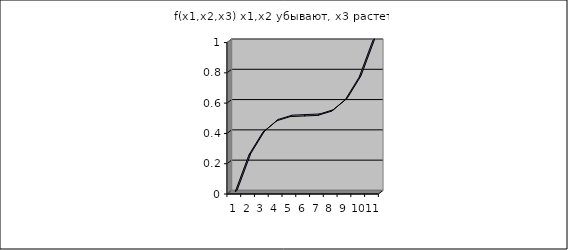
| Category | f(x1,x2,x3) x1,x2 убывают, x3 растет |
|---|---|
| 0 | 0 |
| 1 | 0.244 |
| 2 | 0.392 |
| 3 | 0.468 |
| 4 | 0.496 |
| 5 | 0.5 |
| 6 | 0.504 |
| 7 | 0.532 |
| 8 | 0.608 |
| 9 | 0.756 |
| 10 | 1 |